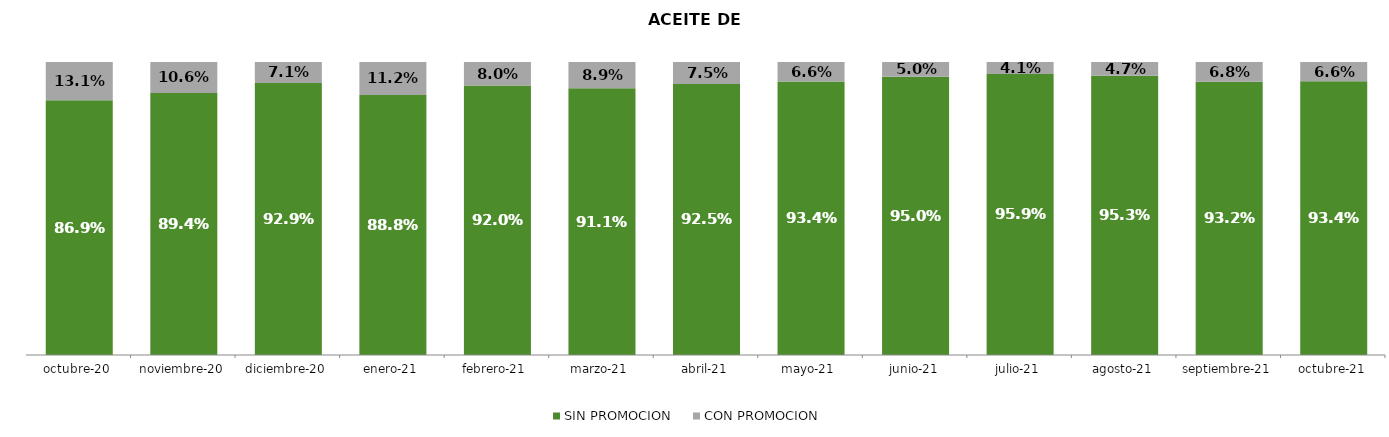
| Category | SIN PROMOCION   | CON PROMOCION   |
|---|---|---|
| 2020-10-01 | 0.869 | 0.131 |
| 2020-11-01 | 0.894 | 0.106 |
| 2020-12-01 | 0.929 | 0.071 |
| 2021-01-01 | 0.888 | 0.112 |
| 2021-02-01 | 0.92 | 0.08 |
| 2021-03-01 | 0.911 | 0.089 |
| 2021-04-01 | 0.925 | 0.075 |
| 2021-05-01 | 0.934 | 0.066 |
| 2021-06-01 | 0.95 | 0.05 |
| 2021-07-01 | 0.959 | 0.041 |
| 2021-08-01 | 0.953 | 0.047 |
| 2021-09-01 | 0.932 | 0.068 |
| 2021-10-01 | 0.934 | 0.066 |